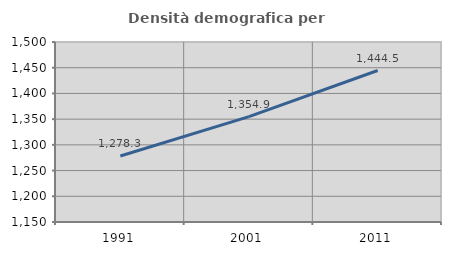
| Category | Densità demografica |
|---|---|
| 1991.0 | 1278.261 |
| 2001.0 | 1354.918 |
| 2011.0 | 1444.513 |